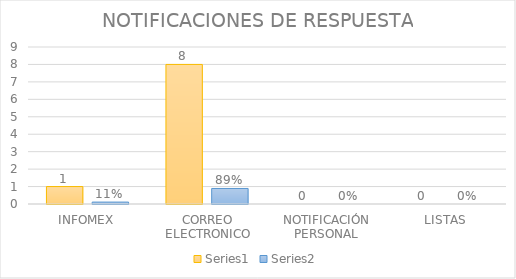
| Category | Series 3 | Series 4 |
|---|---|---|
| INFOMEX | 1 | 0.11 |
| CORREO ELECTRONICO | 8 | 0.89 |
| NOTIFICACIÓN PERSONAL | 0 | 0 |
| LISTAS | 0 | 0 |